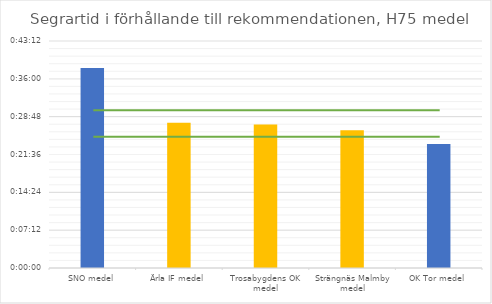
| Category | H75 tid |
|---|---|
| SNO medel | 0.026 |
| Ärla IF medel | 0.019 |
| Trosabygdens OK medel | 0.019 |
| Strängnäs Malmby medel | 0.018 |
| OK Tor medel | 0.016 |